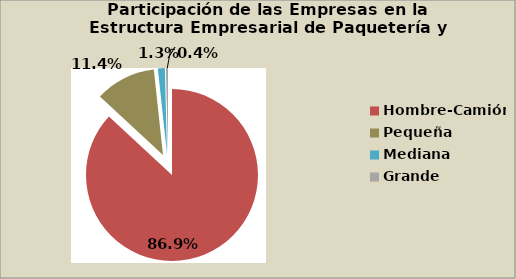
| Category | Series 0 |
|---|---|
| Hombre-Camión | 86.885 |
| Pequeña | 11.41 |
| Mediana | 1.311 |
| Grande | 0.393 |